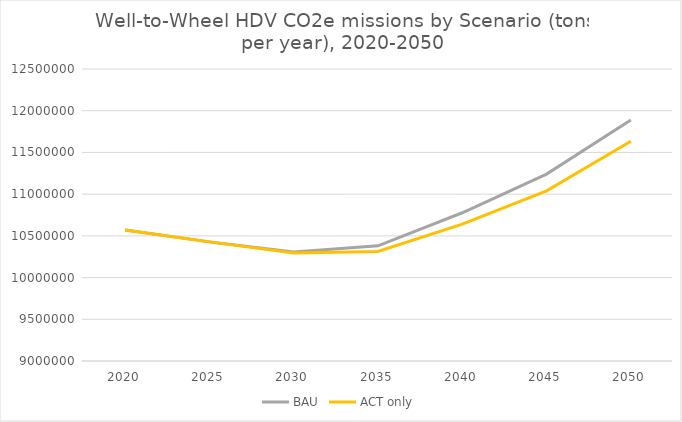
| Category | BAU | ACT only |
|---|---|---|
| 2020.0 | 10570723.255 | 10570723.255 |
| 2025.0 | 10427957.255 | 10427957.255 |
| 2030.0 | 10305755.496 | 10293207.769 |
| 2035.0 | 10380892.019 | 10313055.151 |
| 2040.0 | 10777031.325 | 10640198.537 |
| 2045.0 | 11240180.156 | 11040082.483 |
| 2050.0 | 11888389.148 | 11634018.038 |